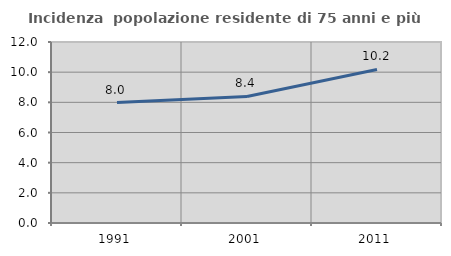
| Category | Incidenza  popolazione residente di 75 anni e più |
|---|---|
| 1991.0 | 7.983 |
| 2001.0 | 8.393 |
| 2011.0 | 10.181 |